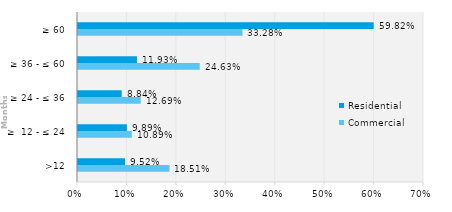
| Category | Commercial | Residential |
|---|---|---|
| >12 | 0.185 | 0.095 |
| ≥  12 - ≤ 24 | 0.109 | 0.099 |
| ≥ 24 - ≤ 36 | 0.127 | 0.088 |
| ≥ 36 - ≤ 60 | 0.246 | 0.119 |
| ≥ 60 | 0.333 | 0.598 |